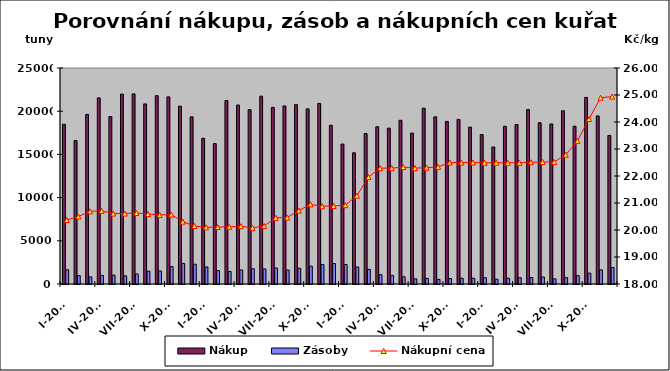
| Category | Nákup | Zásoby |
|---|---|---|
| I-2009 | 18484 | 1647 |
| II-2009 | 16606 | 972 |
| III-2009 | 19624 | 825 |
| IV-2009 | 21542 | 996 |
| V-2009 | 19385 | 1020 |
| VI-2009 | 21978 | 942 |
| VII-2009 | 22005 | 1160 |
| VIII-2009 | 20845 | 1488 |
| IX-2009 | 21795 | 1509 |
| X-2009 | 21658 | 2008 |
| XI-2009 | 20586 | 2377 |
| XII-2009 | 19350 | 2283 |
| I-2010 | 16861 | 1967 |
| II-2010 | 16248 | 1548 |
| III-2010 | 21234 | 1454 |
| IV-2010 | 20714 | 1622 |
| V-2010 | 20176 | 1768 |
| VI-2010 | 21741 | 1742 |
| VII-2010 | 20446 | 1855 |
| VIII-2010 | 20611 | 1615 |
| IX-2010 | 20755 | 1823 |
| X-2010 | 20270 | 2071 |
| XI-2010 | 20900 | 2248 |
| XII-2010 | 18374 | 2363 |
| I-2011 | 16193 | 2251 |
| II-2011 | 15184 | 1971 |
| III-2011 | 17422 | 1697 |
| IV-2011 | 18199 | 1077 |
| V-2011 | 18038 | 996 |
| VI-2011 | 18948 | 837 |
| VII-2011 | 17467 | 601 |
| VIII-2011 | 20347 | 646 |
| IX-2011 | 19346 | 527 |
| X-2011 | 18814 | 626 |
| XI-2011 | 19048 | 665 |
| XII-2011 | 18154 | 671 |
| I-2012 | 17302 | 730 |
| II-2012 | 15861 | 550 |
| III-2012 | 18251 | 666 |
| IV-2012 | 18456 | 736 |
| V-2012 | 20189 | 743 |
| VI-2012 | 18665 | 809 |
| VII-2012 | 18525 | 597 |
| VIII-2012 | 20045 | 729 |
| IX-2012 | 18261 | 965 |
| X-2012 | 21598 | 1253 |
| XI-2012 | 19450 | 1639 |
| XII-2012 | 17192 | 1911 |